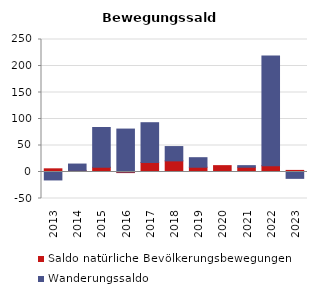
| Category | Saldo natürliche Bevölkerungsbewegungen | Wanderungssaldo |
|---|---|---|
| 2013.0 | 6 | -15 |
| 2014.0 | 3 | 12 |
| 2015.0 | 9 | 75 |
| 2016.0 | -3 | 81 |
| 2017.0 | 18 | 75 |
| 2018.0 | 21 | 27 |
| 2019.0 | 9 | 18 |
| 2020.0 | 12 | 0 |
| 2021.0 | 9 | 3 |
| 2022.0 | 12 | 207 |
| 2023.0 | 3 | -12 |